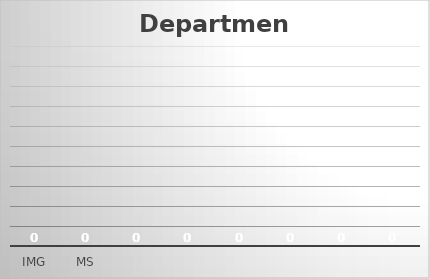
| Category | Department |
|---|---|
| IMG | 0 |
| MS | 0 |